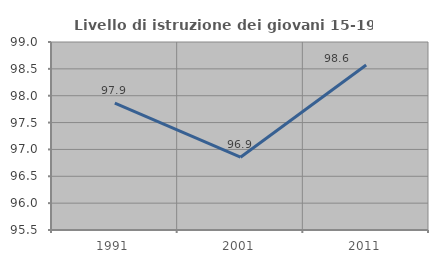
| Category | Livello di istruzione dei giovani 15-19 anni |
|---|---|
| 1991.0 | 97.861 |
| 2001.0 | 96.855 |
| 2011.0 | 98.571 |